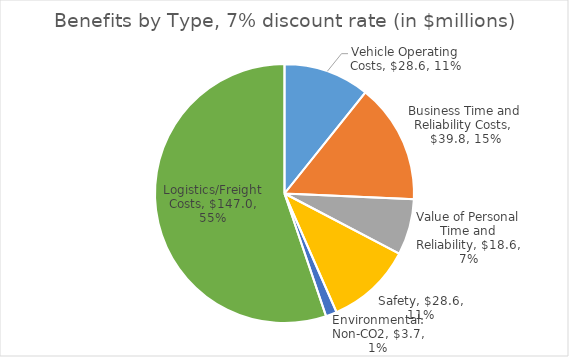
| Category | Series 0 |
|---|---|
| Vehicle Operating Costs | 28.582 |
| Business Time and Reliability Costs | 39.848 |
| Value of Personal Time and Reliability | 18.604 |
| Safety | 28.576 |
| Environmental: Non-CO2 | 3.67 |
| Logistics/Freight Costs | 146.956 |